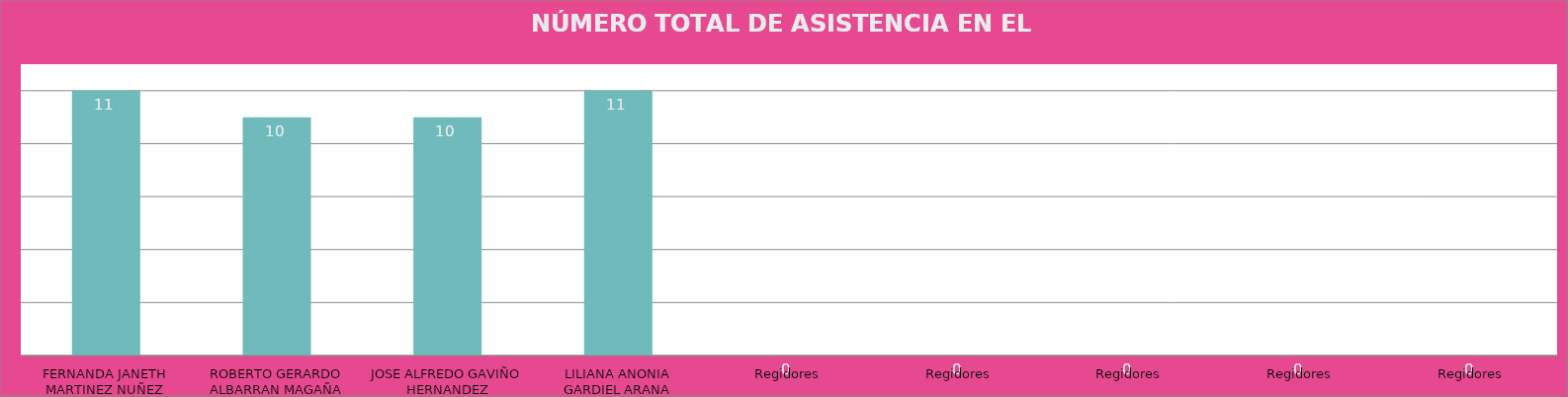
| Category | FERNANDA JANETH MARTINEZ NUÑEZ |
|---|---|
| FERNANDA JANETH MARTINEZ NUÑEZ | 11 |
| ROBERTO GERARDO ALBARRAN MAGAÑA | 10 |
| JOSE ALFREDO GAVIÑO HERNANDEZ | 10 |
| LILIANA ANONIA GARDIEL ARANA | 11 |
| Regidores | 0 |
| Regidores | 0 |
| Regidores | 0 |
| Regidores | 0 |
| Regidores | 0 |